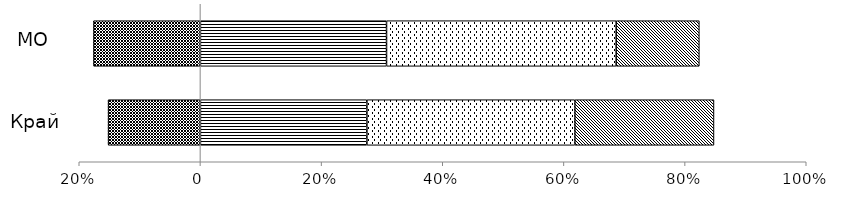
| Category | Пониженный | Недостаточный | Базовый | Повышенный |
|---|---|---|---|---|
|  | 0.275 | -0.152 | 0.343 | 0.23 |
|  | 0.307 | -0.176 | 0.379 | 0.137 |